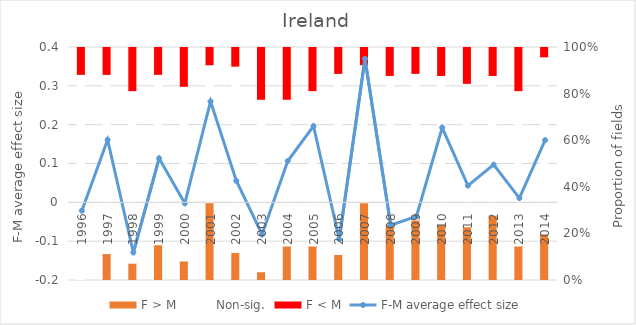
| Category | F > M | Non-sig. | F < M |
|---|---|---|---|
| 0 | 0 | 23 | 3 |
| 1 | 3 | 20 | 3 |
| 2 | 2 | 20 | 5 |
| 3 | 4 | 19 | 3 |
| 4 | 2 | 18 | 4 |
| 5 | 9 | 16 | 2 |
| 6 | 3 | 20 | 2 |
| 7 | 1 | 20 | 6 |
| 8 | 4 | 17 | 6 |
| 9 | 4 | 18 | 5 |
| 10 | 3 | 21 | 3 |
| 11 | 9 | 16 | 2 |
| 12 | 6 | 16 | 3 |
| 13 | 7 | 17 | 3 |
| 14 | 6 | 16 | 3 |
| 15 | 6 | 16 | 4 |
| 16 | 7 | 15 | 3 |
| 17 | 4 | 18 | 5 |
| 18 | 5 | 19 | 1 |